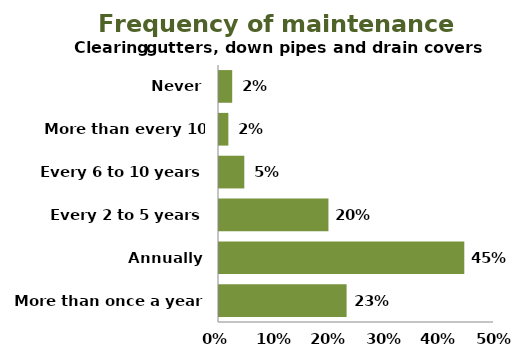
| Category | % |
|---|---|
| More than once a year | 0.232 |
| Annually | 0.446 |
| Every 2 to 5 years | 0.199 |
| Every 6 to 10 years | 0.046 |
| More than every 10 years | 0.017 |
| Never | 0.024 |